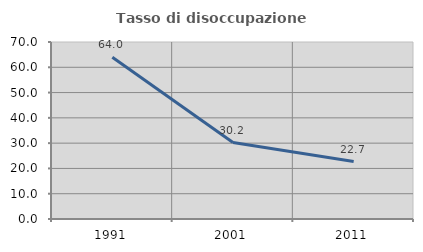
| Category | Tasso di disoccupazione giovanile  |
|---|---|
| 1991.0 | 63.959 |
| 2001.0 | 30.233 |
| 2011.0 | 22.727 |